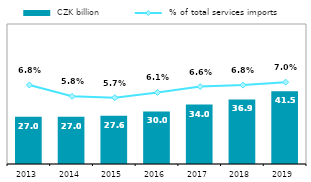
| Category |  CZK billion |
|---|---|
| 2013.0 | 27.011 |
| 2014.0 | 27.005 |
| 2015.0 | 27.615 |
| 2016.0 | 30.003 |
| 2017.0 | 33.956 |
| 2018.0 | 36.888 |
| 2019.0 | 41.504 |